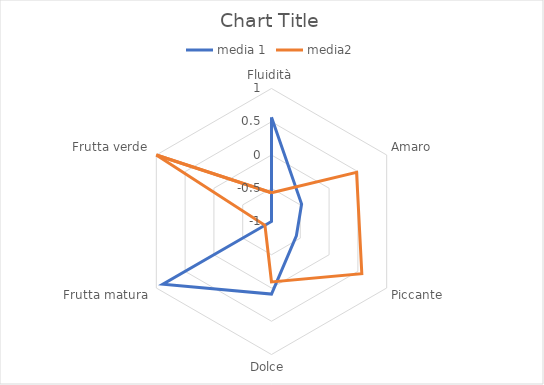
| Category | media 1 | media2 |
|---|---|---|
| Fluidità | 0.568 | -0.568 |
| Amaro | -0.477 | 0.477 |
| Piccante | -0.568 | 0.568 |
| Dolce  | 0.091 | -0.091 |
| Frutta matura | 0.886 | -0.886 |
| Frutta verde | -1 | 1 |